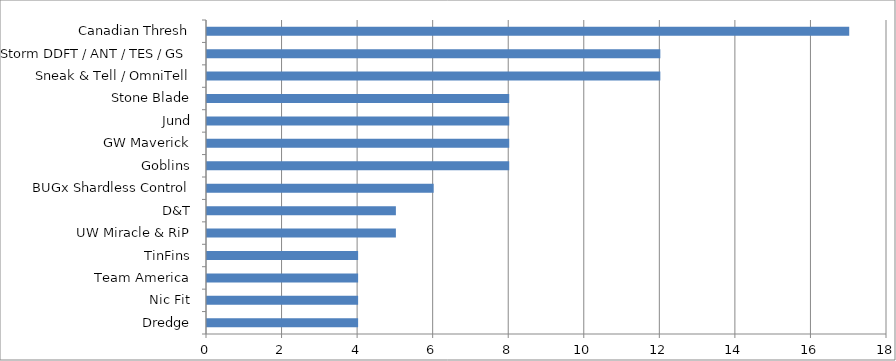
| Category | Series 0 |
|---|---|
| Dredge | 4 |
| Nic Fit | 4 |
| Team America | 4 |
| TinFins | 4 |
| UW Miracle & RiP | 5 |
| D&T | 5 |
| BUGx Shardless Control | 6 |
| Goblins | 8 |
| GW Maverick | 8 |
| Jund | 8 |
| Stone Blade | 8 |
| Sneak & Tell / OmniTell | 12 |
| Storm DDFT / ANT / TES / GS | 12 |
| Canadian Thresh | 17 |